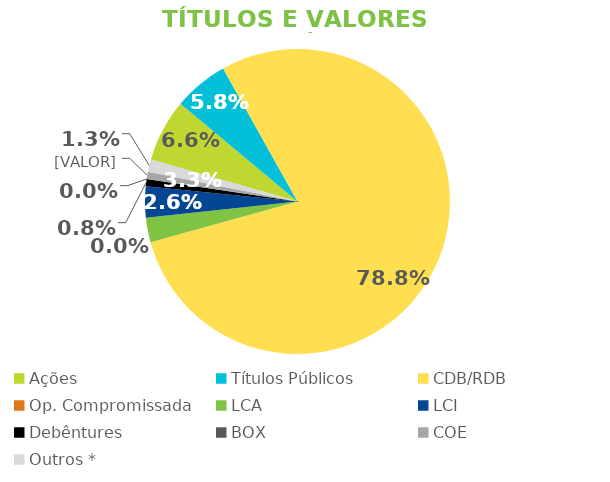
| Category | TVM |
|---|---|
| Ações | 0.066 |
| Títulos Públicos | 0.058 |
| CDB/RDB | 0.788 |
| Op. Compromissada | 0 |
| LCA | 0.026 |
| LCI | 0.033 |
| Debêntures | 0.008 |
| BOX | 0 |
| COE | 0.008 |
| Outros * | 0.013 |